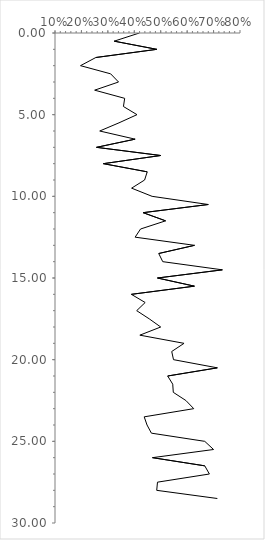
| Category | Series 0 |
|---|---|
| 0.41935483870967744 | 0 |
| 0.323943661971831 | 0.5 |
| 0.4852941176470588 | 1 |
| 0.2545454545454545 | 1.5 |
| 0.19653179190751446 | 2 |
| 0.3105590062111801 | 2.5 |
| 0.3404255319148936 | 3 |
| 0.25 | 3.5 |
| 0.36363636363636365 | 4 |
| 0.358974358974359 | 4.5 |
| 0.41025641025641024 | 5 |
| 0.34210526315789475 | 5.5 |
| 0.2692307692307692 | 6 |
| 0.4032258064516129 | 6.5 |
| 0.2571428571428571 | 7 |
| 0.5 | 7.5 |
| 0.2830188679245283 | 8 |
| 0.4489795918367347 | 8.5 |
| 0.43902439024390244 | 9 |
| 0.3898305084745763 | 9.5 |
| 0.4673913043478261 | 10 |
| 0.68 | 10.5 |
| 0.43333333333333335 | 11 |
| 0.5185185185185185 | 11.5 |
| 0.423728813559322 | 12 |
| 0.4032258064516129 | 12.5 |
| 0.627906976744186 | 13 |
| 0.4925373134328358 | 13.5 |
| 0.5076923076923077 | 14 |
| 0.7333333333333333 | 14.5 |
| 0.4878048780487805 | 15 |
| 0.6274509803921569 | 15.5 |
| 0.3888888888888889 | 16 |
| 0.4411764705882353 | 16.5 |
| 0.4090909090909091 | 17 |
| 0.45652173913043476 | 17.5 |
| 0.5 | 18 |
| 0.42105263157894735 | 18.5 |
| 0.5882352941176471 | 19 |
| 0.5416666666666666 | 19.5 |
| 0.5483870967741935 | 20 |
| 0.7142857142857143 | 20.5 |
| 0.5263157894736842 | 21 |
| 0.5454545454545454 | 21.5 |
| 0.5476190476190477 | 22 |
| 0.5952380952380952 | 22.5 |
| 0.625 | 23 |
| 0.4375 | 23.5 |
| 0.4482758620689655 | 24 |
| 0.4647887323943662 | 24.5 |
| 0.6666666666666666 | 25 |
| 0.7 | 25.5 |
| 0.46875 | 26 |
| 0.6666666666666666 | 26.5 |
| 0.6842105263157895 | 27 |
| 0.4878048780487805 | 27.5 |
| 0.48484848484848486 | 28 |
| 0.7142857142857143 | 28.5 |